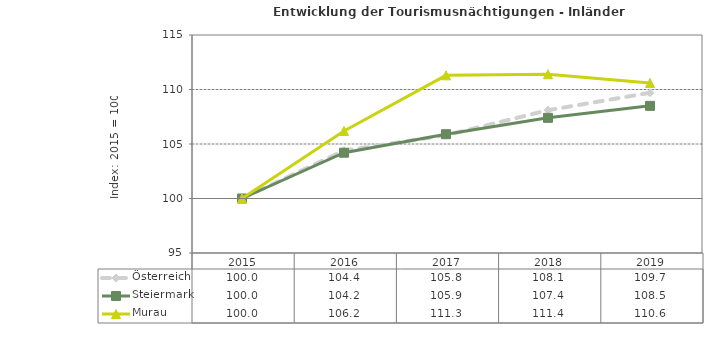
| Category | Österreich | Steiermark | Murau |
|---|---|---|---|
| 2019.0 | 109.7 | 108.5 | 110.6 |
| 2018.0 | 108.1 | 107.4 | 111.4 |
| 2017.0 | 105.8 | 105.9 | 111.3 |
| 2016.0 | 104.4 | 104.2 | 106.2 |
| 2015.0 | 100 | 100 | 100 |